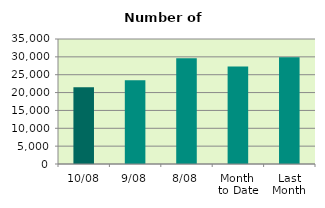
| Category | Series 0 |
|---|---|
| 10/08 | 21508 |
| 9/08 | 23474 |
| 8/08 | 29626 |
| Month 
to Date | 27268.75 |
| Last
Month | 29864.476 |